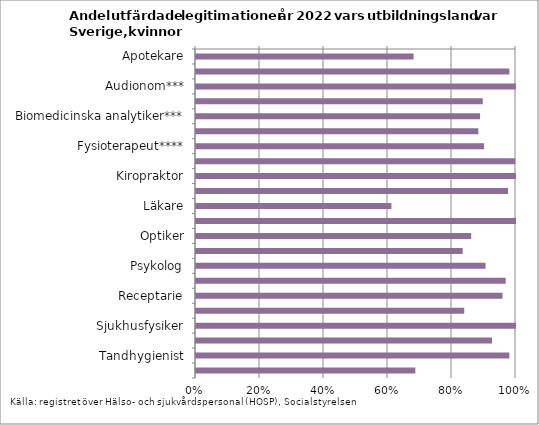
| Category | Series 0 |
|---|---|
| Apotekare | 0.68 |
| Arbetsterapeut | 0.979 |
| Audionom*** | 1 |
| Barnmorska | 0.896 |
| Biomedicinska analytiker*** | 0.888 |
| Dietist*** | 0.882 |
| Fysioterapeut**** | 0.9 |
| Hälso- och sjukvårdskurator*** | 0.998 |
| Kiropraktor | 1 |
| Logoped | 0.975 |
| Läkare | 0.611 |
| Naprapat | 1 |
| Optiker | 0.86 |
| Ortopedingenjör*** | 0.833 |
| Psykolog | 0.905 |
| Psykoterapeut | 0.968 |
| Receptarie | 0.958 |
| Röntgensjuksköterska*** | 0.838 |
| Sjukhusfysiker | 1 |
| Sjuksköterska | 0.925 |
| Tandhygienist | 0.979 |
| Tandläkare | 0.685 |